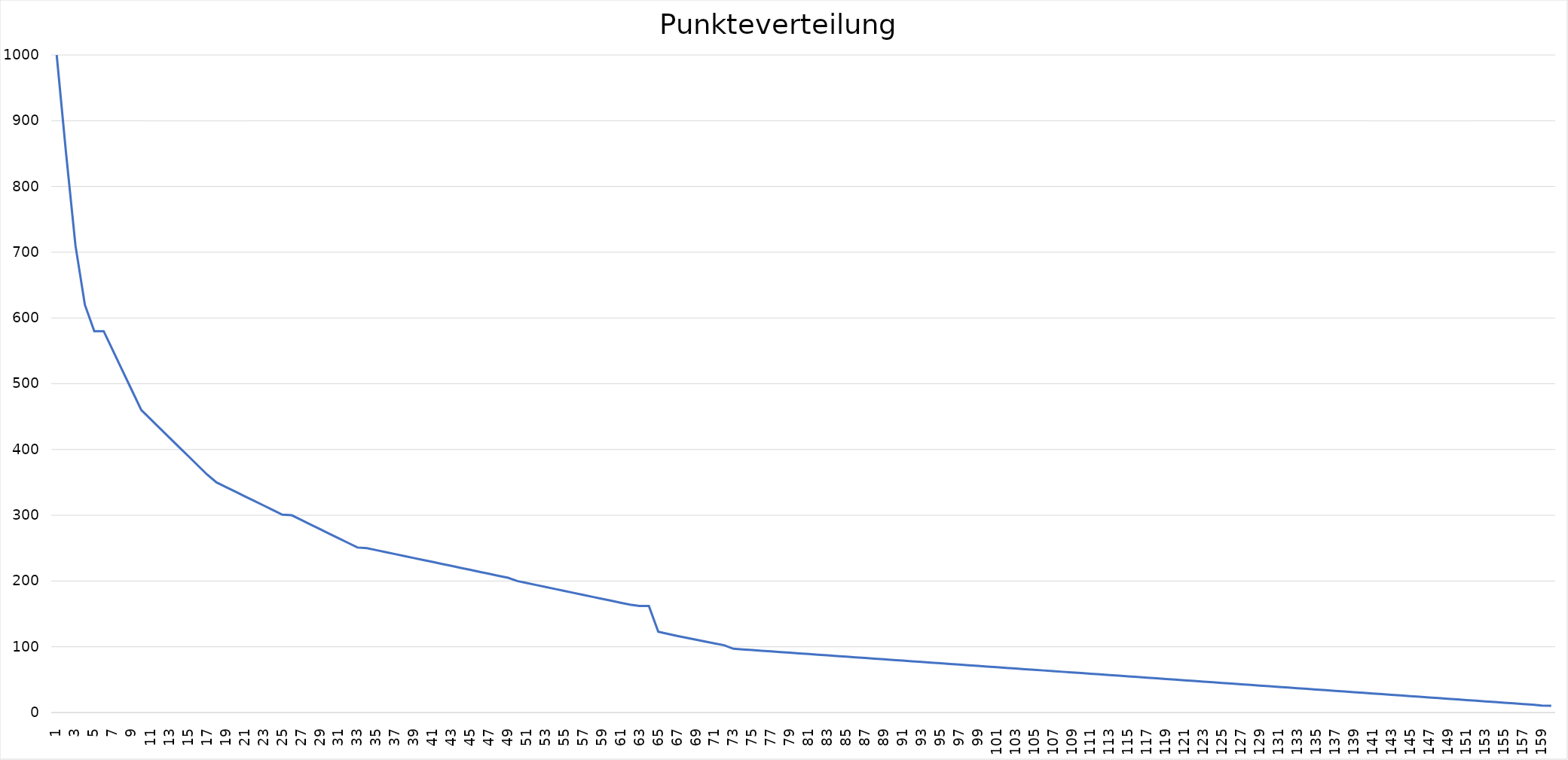
| Category | Punkte |
|---|---|
| 1.0 | 1000 |
| 2.0 | 850 |
| 3.0 | 710 |
| 4.0 | 620 |
| 5.0 | 580 |
| 6.0 | 580 |
| 7.0 | 550 |
| 8.0 | 520 |
| 9.0 | 490 |
| 10.0 | 460 |
| 11.0 | 446 |
| 12.0 | 432 |
| 13.0 | 418 |
| 14.0 | 404 |
| 15.0 | 390 |
| 16.0 | 376 |
| 17.0 | 362 |
| 18.0 | 350 |
| 19.0 | 343 |
| 20.0 | 336 |
| 21.0 | 329 |
| 22.0 | 322 |
| 23.0 | 315 |
| 24.0 | 308 |
| 25.0 | 301 |
| 26.0 | 300 |
| 27.0 | 293 |
| 28.0 | 286 |
| 29.0 | 279 |
| 30.0 | 272 |
| 31.0 | 265 |
| 32.0 | 258 |
| 33.0 | 251 |
| 34.0 | 250 |
| 35.0 | 247 |
| 36.0 | 244 |
| 37.0 | 241 |
| 38.0 | 238 |
| 39.0 | 235 |
| 40.0 | 232 |
| 41.0 | 229 |
| 42.0 | 226 |
| 43.0 | 223 |
| 44.0 | 220 |
| 45.0 | 217 |
| 46.0 | 214 |
| 47.0 | 211 |
| 48.0 | 208 |
| 49.0 | 205 |
| 50.0 | 200 |
| 51.0 | 197 |
| 52.0 | 194 |
| 53.0 | 191 |
| 54.0 | 188 |
| 55.0 | 185 |
| 56.0 | 182 |
| 57.0 | 179 |
| 58.0 | 176 |
| 59.0 | 173 |
| 60.0 | 170 |
| 61.0 | 167 |
| 62.0 | 164 |
| 63.0 | 162 |
| 64.0 | 162 |
| 65.0 | 122.855 |
| 66.0 | 119.702 |
| 67.0 | 116.63 |
| 68.0 | 113.636 |
| 69.0 | 110.72 |
| 70.0 | 107.878 |
| 71.0 | 105.11 |
| 72.0 | 102.412 |
| 73.0 | 97 |
| 74.0 | 96 |
| 75.0 | 95 |
| 76.0 | 94 |
| 77.0 | 93 |
| 78.0 | 92 |
| 79.0 | 91 |
| 80.0 | 90 |
| 81.0 | 89 |
| 82.0 | 88 |
| 83.0 | 87 |
| 84.0 | 86 |
| 85.0 | 85 |
| 86.0 | 84 |
| 87.0 | 83 |
| 88.0 | 82 |
| 89.0 | 81 |
| 90.0 | 80 |
| 91.0 | 79 |
| 92.0 | 78 |
| 93.0 | 77 |
| 94.0 | 76 |
| 95.0 | 75 |
| 96.0 | 74 |
| 97.0 | 73 |
| 98.0 | 72 |
| 99.0 | 71 |
| 100.0 | 70 |
| 101.0 | 69 |
| 102.0 | 68 |
| 103.0 | 67 |
| 104.0 | 66 |
| 105.0 | 65 |
| 106.0 | 64 |
| 107.0 | 63 |
| 108.0 | 62 |
| 109.0 | 61 |
| 110.0 | 60 |
| 111.0 | 59 |
| 112.0 | 58 |
| 113.0 | 57 |
| 114.0 | 56 |
| 115.0 | 55 |
| 116.0 | 54 |
| 117.0 | 53 |
| 118.0 | 52 |
| 119.0 | 51 |
| 120.0 | 50 |
| 121.0 | 49 |
| 122.0 | 48 |
| 123.0 | 47 |
| 124.0 | 46 |
| 125.0 | 45 |
| 126.0 | 44 |
| 127.0 | 43 |
| 128.0 | 42 |
| 129.0 | 41 |
| 130.0 | 40 |
| 131.0 | 39 |
| 132.0 | 38 |
| 133.0 | 37 |
| 134.0 | 36 |
| 135.0 | 35 |
| 136.0 | 34 |
| 137.0 | 33 |
| 138.0 | 32 |
| 139.0 | 31 |
| 140.0 | 30 |
| 141.0 | 29 |
| 142.0 | 28 |
| 143.0 | 27 |
| 144.0 | 26 |
| 145.0 | 25 |
| 146.0 | 24 |
| 147.0 | 23 |
| 148.0 | 22 |
| 149.0 | 21 |
| 150.0 | 20 |
| 151.0 | 19 |
| 152.0 | 18 |
| 153.0 | 17 |
| 154.0 | 16 |
| 155.0 | 15 |
| 156.0 | 14 |
| 157.0 | 13 |
| 158.0 | 12 |
| 159.0 | 10.665 |
| 160.0 | 10.392 |